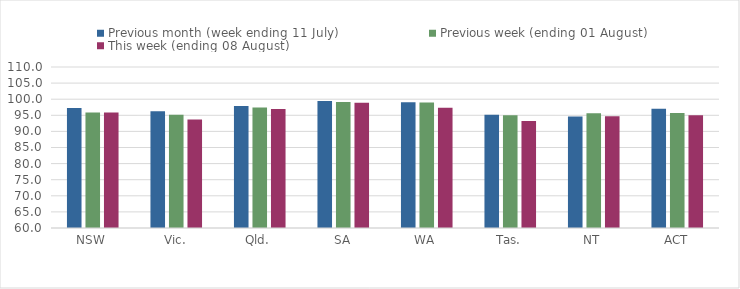
| Category | Previous month (week ending 11 July) | Previous week (ending 01 August) | This week (ending 08 August) |
|---|---|---|---|
| NSW | 97.273 | 95.841 | 95.841 |
| Vic. | 96.256 | 95.204 | 93.723 |
| Qld. | 97.927 | 97.395 | 96.958 |
| SA | 99.473 | 99.099 | 98.862 |
| WA | 99.043 | 99.007 | 97.307 |
| Tas. | 95.145 | 95.05 | 93.242 |
| NT | 94.593 | 95.61 | 94.702 |
| ACT | 97.04 | 95.723 | 94.982 |